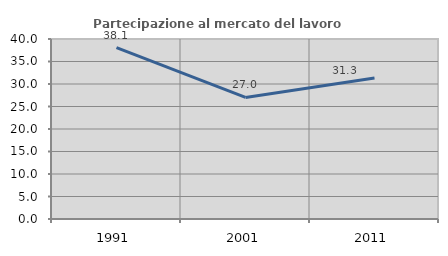
| Category | Partecipazione al mercato del lavoro  femminile |
|---|---|
| 1991.0 | 38.095 |
| 2001.0 | 27.022 |
| 2011.0 | 31.34 |